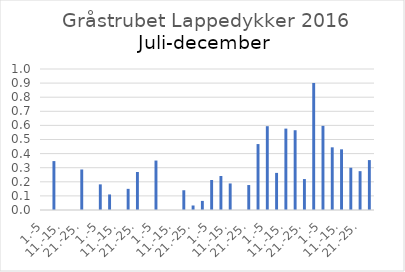
| Category | Series 0 |
|---|---|
| 1.-5 | 0 |
| 6.-10. | 0.347 |
| 11.-15. | 0 |
| 16.-20. | 0 |
| 21.-25. | 0.287 |
| 26.-31. | 0 |
| 1.-5 | 0.182 |
| 6.-10. | 0.11 |
| 11.-15. | 0 |
| 16.-20. | 0.15 |
| 21.-25. | 0.27 |
| 26.-31. | 0 |
| 1.-5 | 0.351 |
| 6.-10. | 0 |
| 11.-15. | 0 |
| 16.-20. | 0.14 |
| 21.-25. | 0.032 |
| 26.-30. | 0.065 |
| 1.-5 | 0.213 |
| 6.-10. | 0.241 |
| 11.-15. | 0.188 |
| 16.-20. | 0 |
| 21.-25. | 0.177 |
| 26.-31. | 0.468 |
| 1.-5 | 0.594 |
| 6.-10. | 0.263 |
| 11.-15. | 0.577 |
| 16.-20. | 0.566 |
| 21.-25. | 0.22 |
| 26.-30. | 0.901 |
| 1.-5 | 0.597 |
| 6.-10. | 0.444 |
| 11.-15. | 0.43 |
| 16.-20. | 0.3 |
| 21.-25. | 0.275 |
| 26.-31. | 0.354 |